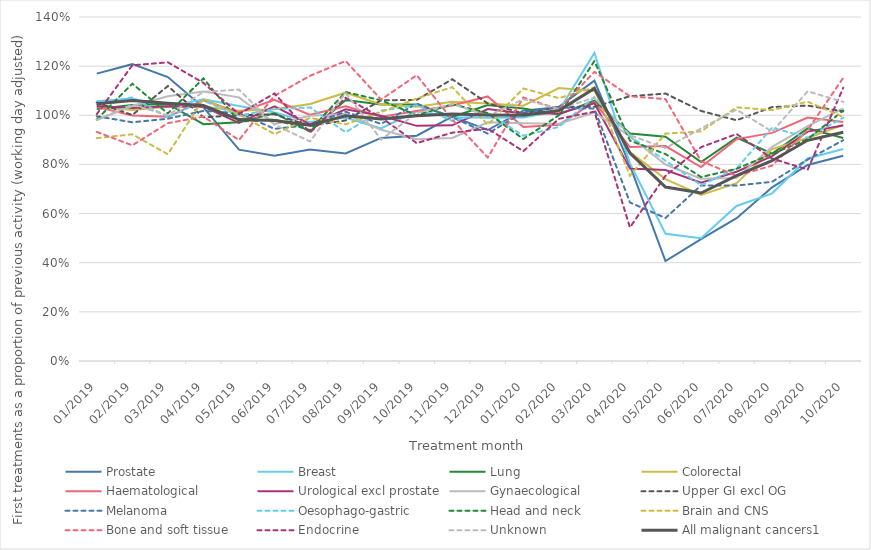
| Category | Prostate | Breast | Lung | Colorectal | Haematological | Urological excl prostate | Gynaecological | Upper GI excl OG | Melanoma | Oesophago-gastric | Head and neck | Brain and CNS | Bone and soft tissue | Endocrine | Unknown | All malignant cancers1 |
|---|---|---|---|---|---|---|---|---|---|---|---|---|---|---|---|---|
| 2019-01-01 | 1.17 | 1.058 | 1.025 | 1.036 | 1.034 | 1.038 | 0.981 | 1.052 | 0.996 | 1.045 | 0.983 | 0.907 | 0.932 | 1.005 | 0.981 | 1.047 |
| 2019-02-01 | 1.208 | 1.068 | 1.042 | 1.021 | 0.999 | 1.03 | 1.038 | 1.001 | 0.972 | 1.073 | 1.129 | 0.923 | 0.878 | 1.203 | 1.043 | 1.06 |
| 2019-03-01 | 1.155 | 1.033 | 1.046 | 1.034 | 0.994 | 1.037 | 1.078 | 1.119 | 0.986 | 0.992 | 1.007 | 0.841 | 0.968 | 1.216 | 1 | 1.049 |
| 2019-04-01 | 1.032 | 1.065 | 0.964 | 1.035 | 1.061 | 1.035 | 1.097 | 0.992 | 1.018 | 1.059 | 1.15 | 1.066 | 0.995 | 1.132 | 1.095 | 1.039 |
| 2019-05-01 | 0.86 | 1.038 | 0.972 | 1.019 | 1.012 | 0.969 | 1.073 | 1 | 1.009 | 0.999 | 0.974 | 1.004 | 0.899 | 1.005 | 1.105 | 0.983 |
| 2019-06-01 | 0.836 | 1.011 | 1.008 | 1.025 | 1.062 | 1.037 | 0.963 | 1.004 | 0.945 | 1.025 | 0.983 | 0.923 | 1.079 | 1.089 | 0.962 | 0.979 |
| 2019-07-01 | 0.861 | 0.972 | 0.934 | 1.046 | 1.002 | 0.962 | 0.998 | 0.957 | 0.961 | 1.032 | 0.94 | 0.989 | 1.161 | 0.929 | 0.894 | 0.959 |
| 2019-08-01 | 0.845 | 0.99 | 1.062 | 1.092 | 1.036 | 1.024 | 1.005 | 0.979 | 1.014 | 0.931 | 1.095 | 0.963 | 1.221 | 1.071 | 1.092 | 0.998 |
| 2019-09-01 | 0.908 | 0.947 | 1.044 | 1.044 | 0.994 | 0.998 | 0.941 | 1.061 | 0.965 | 1.019 | 1.061 | 1.013 | 1.064 | 0.991 | 0.901 | 0.985 |
| 2019-10-01 | 0.917 | 1.017 | 1.044 | 1.035 | 1.018 | 0.957 | 0.902 | 1.062 | 1.048 | 1.041 | 1 | 1.068 | 1.163 | 0.887 | 1.009 | 0.999 |
| 2019-11-01 | 0.995 | 0.992 | 0.994 | 1.055 | 1.04 | 0.959 | 0.908 | 1.147 | 0.992 | 0.977 | 1.045 | 1.114 | 0.982 | 0.929 | 1.046 | 1.006 |
| 2019-12-01 | 0.94 | 0.99 | 1.042 | 1.048 | 1.077 | 1.026 | 0.971 | 1.048 | 0.926 | 1.01 | 1.009 | 0.961 | 0.828 | 0.946 | 0.997 | 1.002 |
| 2020-01-01 | 1.019 | 0.991 | 1.027 | 1.039 | 0.953 | 1.008 | 0.968 | 1.008 | 1.012 | 0.917 | 0.903 | 1.109 | 1.073 | 0.854 | 1.066 | 1.001 |
| 2020-02-01 | 1.034 | 1.018 | 1.003 | 1.111 | 0.961 | 1.007 | 0.965 | 1.033 | 1.031 | 0.953 | 1 | 1.07 | 1.024 | 0.986 | 1.025 | 1.019 |
| 2020-03-01 | 1.141 | 1.254 | 1.06 | 1.099 | 1.054 | 1.049 | 1.011 | 1.034 | 1.027 | 1.074 | 1.221 | 1.113 | 1.177 | 1.015 | 1.072 | 1.109 |
| 2020-04-01 | 0.795 | 0.804 | 0.925 | 0.85 | 0.871 | 0.783 | 0.914 | 1.078 | 0.645 | 0.915 | 0.897 | 0.754 | 1.077 | 0.544 | 0.919 | 0.846 |
| 2020-05-01 | 0.407 | 0.518 | 0.913 | 0.74 | 0.875 | 0.778 | 0.8 | 1.088 | 0.582 | 0.815 | 0.842 | 0.926 | 1.066 | 0.754 | 0.867 | 0.708 |
| 2020-06-01 | 0.496 | 0.5 | 0.81 | 0.676 | 0.789 | 0.726 | 0.742 | 1.018 | 0.714 | 0.715 | 0.749 | 0.934 | 0.814 | 0.87 | 0.946 | 0.684 |
| 2020-07-02 | 0.581 | 0.631 | 0.909 | 0.724 | 0.903 | 0.77 | 0.744 | 0.98 | 0.714 | 0.784 | 0.782 | 1.032 | 0.754 | 0.924 | 1.023 | 0.754 |
| 2020-08-01 | 0.707 | 0.682 | 0.844 | 0.862 | 0.928 | 0.834 | 0.871 | 1.033 | 0.729 | 0.95 | 0.843 | 1.021 | 0.795 | 0.824 | 0.933 | 0.815 |
| 2020-09-02 | 0.798 | 0.824 | 0.947 | 0.907 | 0.991 | 0.934 | 0.956 | 1.039 | 0.82 | 0.909 | 0.903 | 1.055 | 0.94 | 0.779 | 1.098 | 0.898 |
| 2020-10-01 | 0.835 | 0.863 | 0.908 | 0.962 | 0.973 | 0.959 | 1.028 | 1.016 | 0.899 | 0.99 | 1.019 | 0.993 | 1.152 | 1.112 | 1.055 | 0.931 |